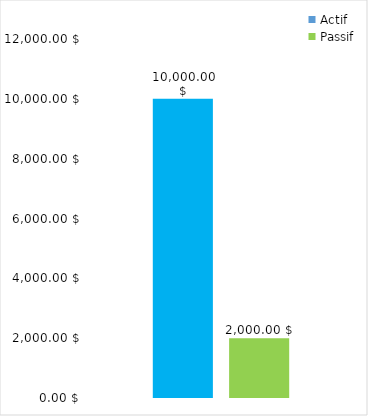
| Category | Actif | Passif |
|---|---|---|
| 0 | 10000 | 2000 |